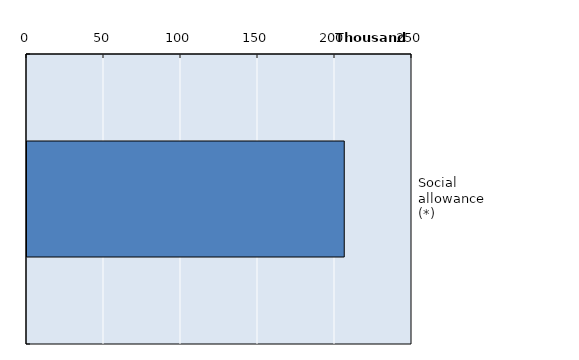
| Category | Series 0 |
|---|---|
| Social allowance (*) | 206000 |